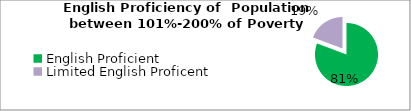
| Category | Percent |
|---|---|
| English Proficient | 0.807 |
| Limited English Proficent | 0.193 |